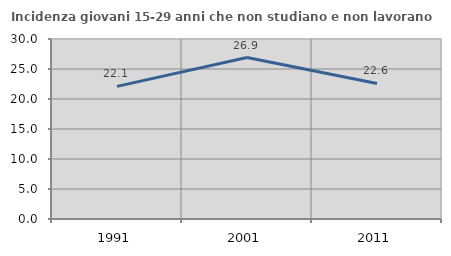
| Category | Incidenza giovani 15-29 anni che non studiano e non lavorano  |
|---|---|
| 1991.0 | 22.099 |
| 2001.0 | 26.91 |
| 2011.0 | 22.593 |